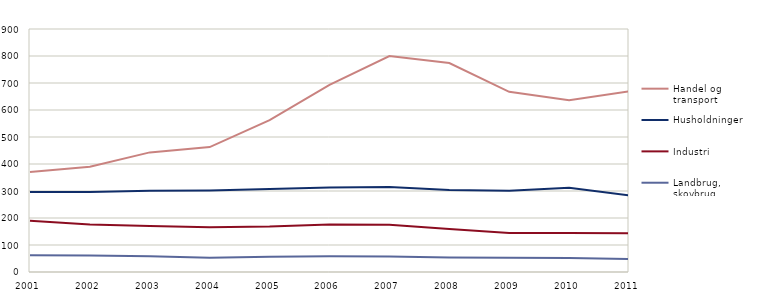
| Category | Handel og transport | Husholdninger | Industri | Landbrug, skovbrug 
og fiskeri |
|---|---|---|---|---|
| 2001 | 370.254 | 296.612 | 190.175 | 62.253 |
| 2002 | 389.689 | 296.706 | 175.571 | 60.656 |
| 2003 | 443.034 | 300.602 | 170.377 | 57.99 |
| 2004 | 462.783 | 302.008 | 165.52 | 53.142 |
| 2005 | 562.252 | 307.135 | 168.212 | 56.255 |
| 2006 | 693.274 | 312.73 | 176.017 | 57.886 |
| 2007 | 799.591 | 314.894 | 174.561 | 57.856 |
| 2008 | 773.849 | 303.329 | 159.372 | 54.09 |
| 2009 | 667.22 | 301.16 | 144.216 | 53.063 |
| 2010 | 635.773 | 312.264 | 144.363 | 51.802 |
| 2011 | 669.184 | 283.363 | 143.281 | 48.084 |